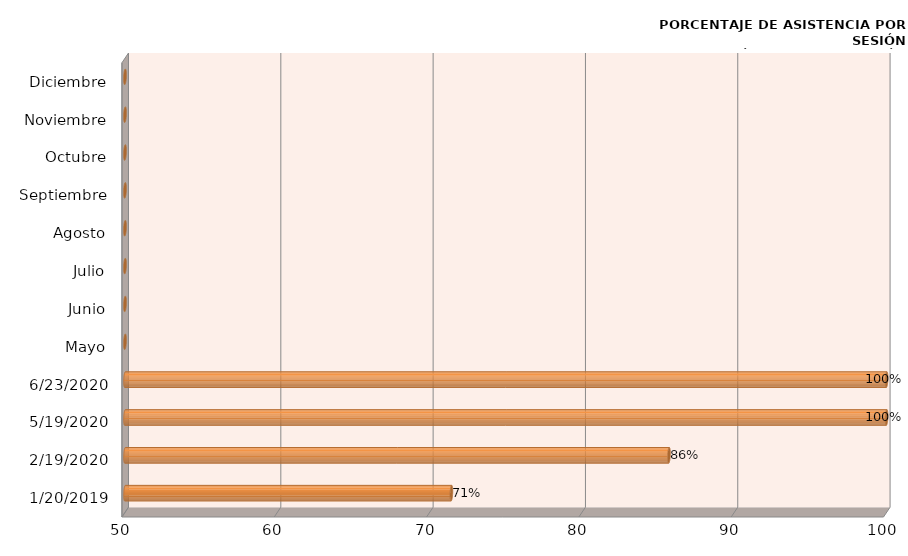
| Category | Series 0 |
|---|---|
| 20/01/2019 | 71.429 |
| 19/02/2020 | 85.714 |
| 19/05/2020 | 100 |
| 23/06/2020 | 100 |
| Mayo | 0 |
| Junio | 0 |
| Julio | 0 |
| Agosto | 0 |
| Septiembre | 0 |
| Octubre | 0 |
| Noviembre | 0 |
| Diciembre | 0 |